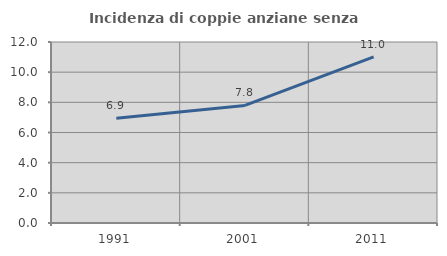
| Category | Incidenza di coppie anziane senza figli  |
|---|---|
| 1991.0 | 6.944 |
| 2001.0 | 7.792 |
| 2011.0 | 11.009 |